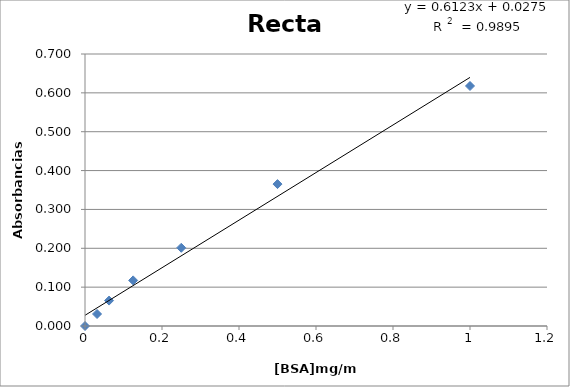
| Category | Series 0 |
|---|---|
| 1.0 | 0.618 |
| 0.5 | 0.365 |
| 0.25 | 0.201 |
| 0.125 | 0.117 |
| 0.0625 | 0.065 |
| 0.03125 | 0.031 |
| 0.0 | 0 |